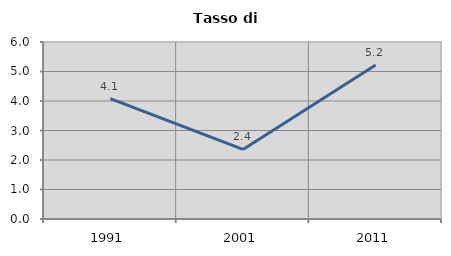
| Category | Tasso di disoccupazione   |
|---|---|
| 1991.0 | 4.082 |
| 2001.0 | 2.358 |
| 2011.0 | 5.224 |